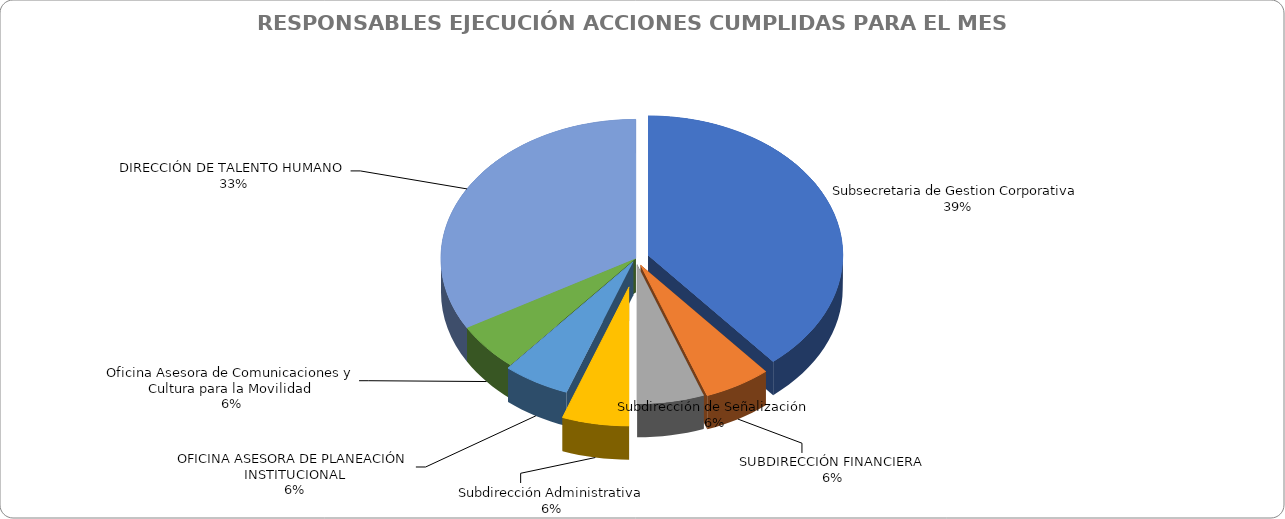
| Category | Cuenta de ESTADO DE LA ACCION |
|---|---|
| Subsecretaria de Gestion Corporativa | 7 |
| SUBDIRECCIÓN FINANCIERA | 1 |
| Subdirección de Señalización | 1 |
| Subdirección Administrativa | 1 |
| OFICINA ASESORA DE PLANEACIÓN INSTITUCIONAL | 1 |
| Oficina Asesora de Comunicaciones y Cultura para la Movilidad | 1 |
| DIRECCIÓN DE TALENTO HUMANO | 6 |